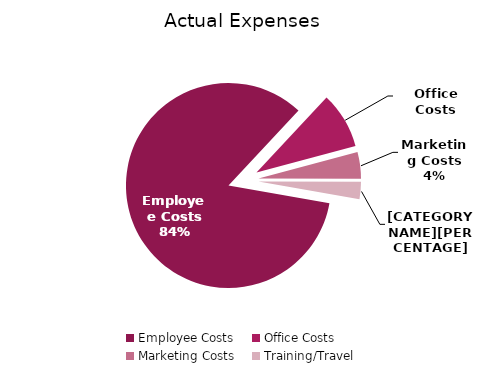
| Category | Series 0 |
|---|---|
| Employee Costs | 659130 |
| Office Costs | 69350 |
| Marketing Costs | 33159 |
| Training/Travel | 21300 |